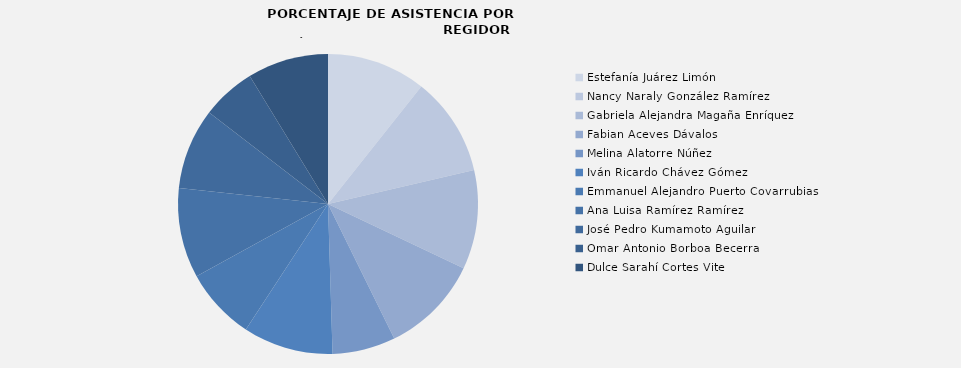
| Category | Estefanía Juárez Limón  |
|---|---|
| Estefanía Juárez Limón  | 100 |
| Nancy Naraly González Ramírez | 100 |
| Gabriela Alejandra Magaña Enríquez | 100 |
| Fabian Aceves Dávalos | 100 |
| Melina Alatorre Núñez | 63.636 |
| Iván Ricardo Chávez Gómez | 90.909 |
| Emmanuel Alejandro Puerto Covarrubias | 72.727 |
| Ana Luisa Ramírez Ramírez | 90.909 |
| José Pedro Kumamoto Aguilar | 81.818 |
| Omar Antonio Borboa Becerra | 54.545 |
| Dulce Sarahí Cortes Vite | 81.818 |